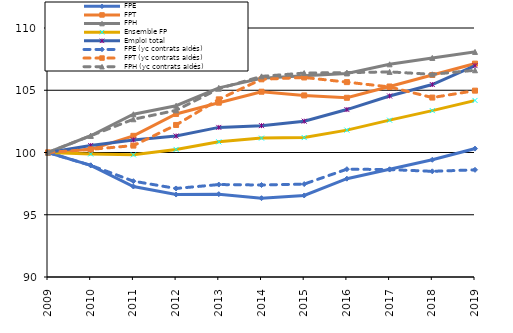
| Category | FPE | FPT | FPH | Ensemble FP | Emploi total | FPE (yc contrats aidés) | FPT (yc contrats aidés) | FPH (yc contrats aidés) |
|---|---|---|---|---|---|---|---|---|
| 2009.0 | 100 | 100 | 100 | 100 | 100 | 100 | 100 | 100 |
| 2010.0 | 98.967 | 100.251 | 101.346 | 99.882 | 100.563 | 98.967 | 100.251 | 101.346 |
| 2011.0 | 97.268 | 101.338 | 103.07 | 99.814 | 101.009 | 97.698 | 100.555 | 102.67 |
| 2012.0 | 96.624 | 103.096 | 103.759 | 100.246 | 101.324 | 97.112 | 102.212 | 103.386 |
| 2013.0 | 96.653 | 104 | 105.193 | 100.855 | 102.016 | 97.425 | 104.27 | 105.126 |
| 2014.0 | 96.33 | 104.881 | 105.958 | 101.157 | 102.158 | 97.39 | 105.878 | 106.115 |
| 2015.0 | 96.55 | 104.585 | 106.158 | 101.2 | 102.516 | 97.464 | 106.027 | 106.382 |
| 2016.0 | 97.899 | 104.395 | 106.352 | 101.797 | 103.449 | 98.661 | 105.653 | 106.415 |
| 2017.0 | 98.652 | 105.301 | 107.083 | 102.597 | 104.539 | 98.629 | 105.266 | 106.476 |
| 2018.0 | 99.417 | 106.224 | 107.597 | 103.364 | 105.458 | 98.488 | 104.412 | 106.279 |
| 2019.0 | 100.313 | 107.138 | 108.08 | 104.182 | 106.978 | 98.608 | 104.968 | 106.606 |